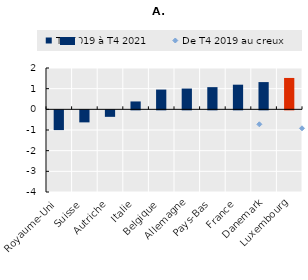
| Category | T4 2019 à T4 2021 |
|---|---|
| Royaume-Uni | -0.956 |
| Suisse | -0.582 |
| Autriche | -0.315 |
| Italie | 0.382 |
| Belgique | 0.956 |
| Allemagne | 1.005 |
| Pays-Bas | 1.074 |
| France | 1.192 |
| Danemark | 1.318 |
| Luxembourg | 1.519 |